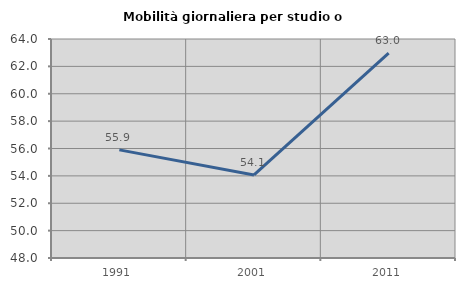
| Category | Mobilità giornaliera per studio o lavoro |
|---|---|
| 1991.0 | 55.899 |
| 2001.0 | 54.065 |
| 2011.0 | 62.968 |